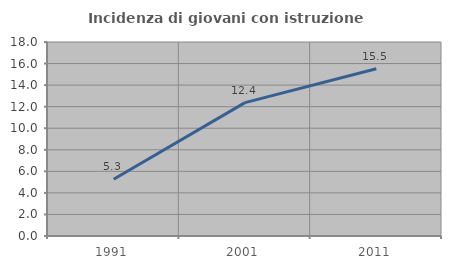
| Category | Incidenza di giovani con istruzione universitaria |
|---|---|
| 1991.0 | 5.263 |
| 2001.0 | 12.371 |
| 2011.0 | 15.517 |